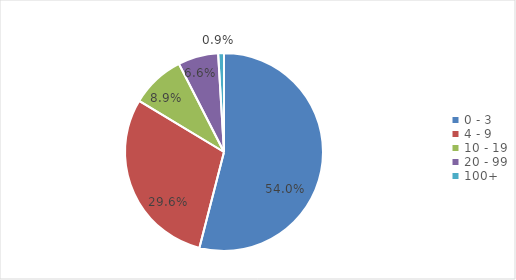
| Category | Enterprises  |
|---|---|
| 0 - 3 | 0.54 |
| 4 - 9 | 0.296 |
| 10 - 19 | 0.089 |
| 20 - 99 | 0.066 |
| 100+ | 0.009 |